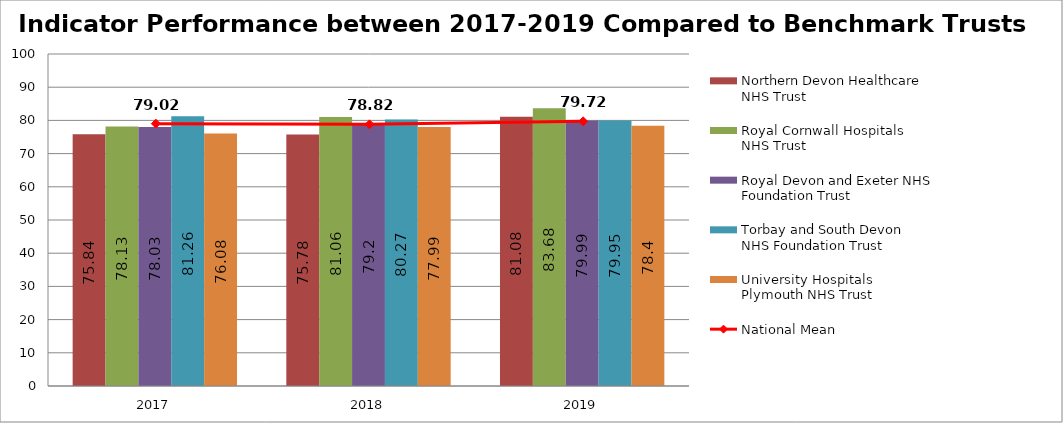
| Category | Northern Devon Healthcare NHS Trust | Royal Cornwall Hospitals NHS Trust | Royal Devon and Exeter NHS Foundation Trust | Torbay and South Devon NHS Foundation Trust | University Hospitals Plymouth NHS Trust |
|---|---|---|---|---|---|
| 2017 | 75.84 | 78.13 | 78.03 | 81.26 | 76.08 |
| 2018 | 75.78 | 81.06 | 79.2 | 80.27 | 77.99 |
| 2019 | 81.08 | 83.68 | 79.99 | 79.95 | 78.4 |